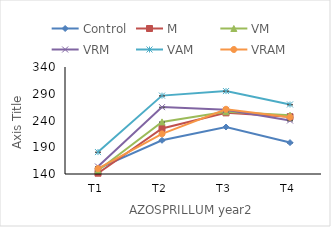
| Category | Control | M | VM | VRM | VAM | VRAM |
|---|---|---|---|---|---|---|
| T1 | 150 | 141.5 | 146.5 | 154 | 181 | 150 |
| T2 | 203 | 225 | 237.4 | 265 | 286.5 | 215 |
| T3 | 227.8 | 254.3 | 256.3 | 260 | 295 | 261 |
| T4 | 198.7 | 247 | 250 | 240 | 270 | 246.1 |